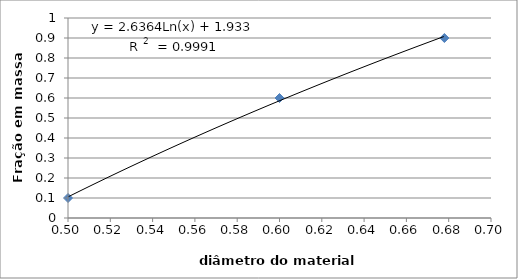
| Category | Fração |
|---|---|
| 0.5 | 0.1 |
| 0.6 | 0.6 |
| 0.6779578367132549 | 0.9 |